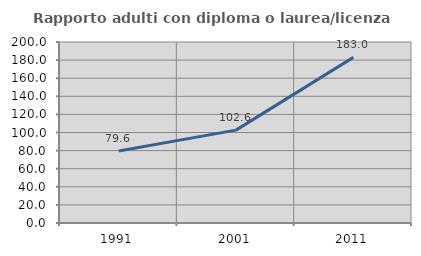
| Category | Rapporto adulti con diploma o laurea/licenza media  |
|---|---|
| 1991.0 | 79.592 |
| 2001.0 | 102.618 |
| 2011.0 | 182.993 |